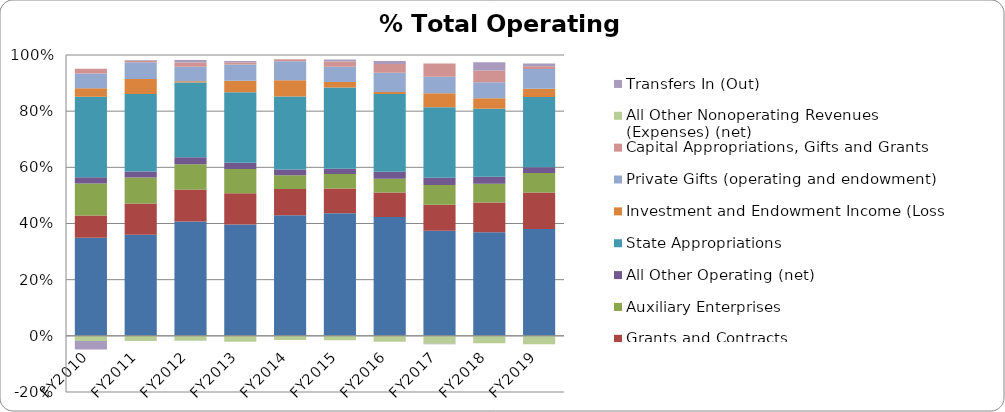
| Category | Net Tuition and Fees | Grants and Contracts | Auxiliary Enterprises | All Other Operating (net) | State Appropriations | Investment and Endowment Income (Loss) | Private Gifts (operating and endowment) | Capital Appropriations, Gifts and Grants | All Other Nonoperating Revenues (Expenses) (net) | Transfers In (Out) |
|---|---|---|---|---|---|---|---|---|---|---|
| FY2010 | 0.361 | 0.083 | 0.118 | 0.023 | 0.297 | 0.031 | 0.054 | 0.018 | -0.019 | -0.031 |
| FY2011 | 0.347 | 0.108 | 0.089 | 0.021 | 0.266 | 0.052 | 0.057 | 0.005 | -0.017 | 0.002 |
| FY2012 | 0.388 | 0.109 | 0.086 | 0.023 | 0.254 | 0.004 | 0.049 | 0.014 | -0.017 | 0.009 |
| FY2013 | 0.384 | 0.107 | 0.084 | 0.021 | 0.243 | 0.039 | 0.056 | 0.007 | -0.02 | 0.005 |
| FY2014 | 0.41 | 0.089 | 0.046 | 0.02 | 0.248 | 0.055 | 0.065 | 0.006 | -0.015 | 0 |
| FY2015 | 0.417 | 0.084 | 0.05 | 0.018 | 0.276 | 0.019 | 0.052 | 0.018 | -0.015 | 0.007 |
| FY2016 | 0.412 | 0.084 | 0.048 | 0.024 | 0.27 | 0.007 | 0.067 | 0.03 | -0.021 | 0.011 |
| FY2017 | 0.375 | 0.093 | 0.07 | 0.026 | 0.251 | 0.05 | 0.058 | 0.048 | -0.029 | -0.001 |
| FY2018 | 0.366 | 0.105 | 0.066 | 0.025 | 0.24 | 0.037 | 0.056 | 0.041 | -0.026 | 0.029 |
| FY2019 | 0.38 | 0.13 | 0.07 | 0.02 | 0.25 | 0.03 | 0.07 | 0.01 | -0.03 | 0.01 |